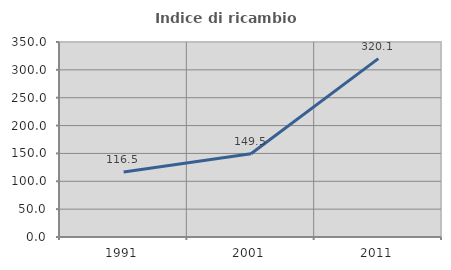
| Category | Indice di ricambio occupazionale  |
|---|---|
| 1991.0 | 116.477 |
| 2001.0 | 149.5 |
| 2011.0 | 320.11 |